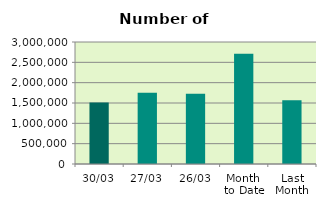
| Category | Series 0 |
|---|---|
| 30/03 | 1514722 |
| 27/03 | 1749282 |
| 26/03 | 1726648 |
| Month 
to Date | 2711003.333 |
| Last
Month | 1567888.4 |